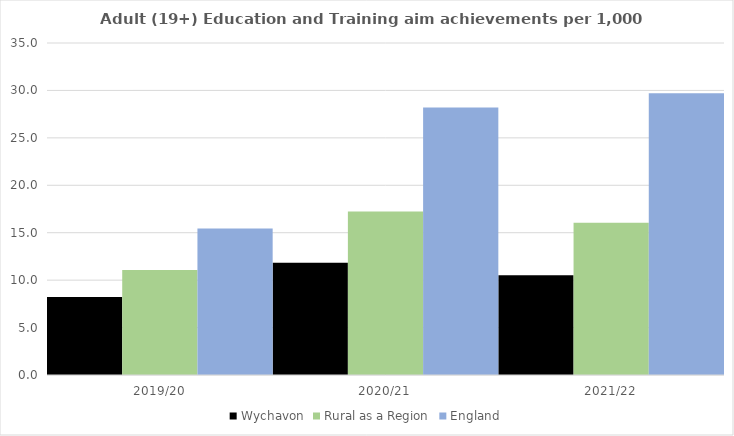
| Category | Wychavon | Rural as a Region | England |
|---|---|---|---|
| 2019/20 | 8.219 | 11.081 | 15.446 |
| 2020/21 | 11.835 | 17.224 | 28.211 |
| 2021/22 | 10.504 | 16.063 | 29.711 |